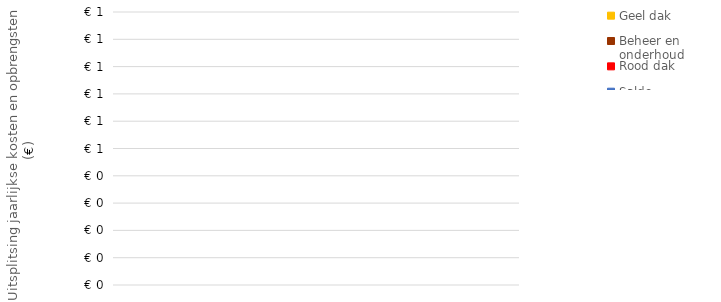
| Category | Geel dak | Beheer en onderhoud | Rood dak | Saldo |
|---|---|---|---|---|
| 0 | 0 | 0 | 0 | 0 |